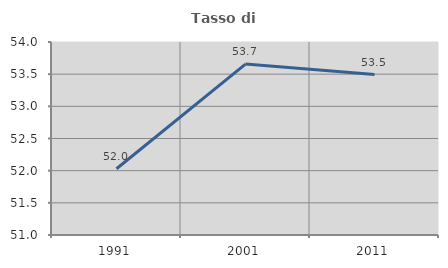
| Category | Tasso di occupazione   |
|---|---|
| 1991.0 | 52.03 |
| 2001.0 | 53.657 |
| 2011.0 | 53.494 |